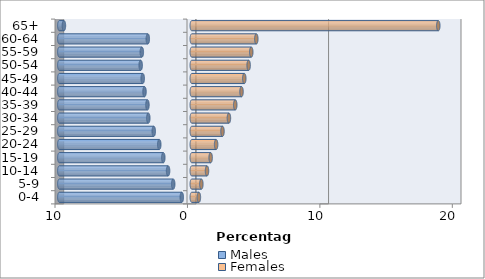
| Category | Males | Females |
|---|---|---|
| 0-4 | -0.754 | 0.536 |
| 5-9 | -1.402 | 0.723 |
| 10-14 | -1.79 | 1.149 |
| 15-19 | -2.15 | 1.424 |
| 20-24 | -2.455 | 1.838 |
| 25-29 | -2.871 | 2.319 |
| 30-34 | -3.283 | 2.805 |
| 35-39 | -3.349 | 3.282 |
| 40-44 | -3.57 | 3.755 |
| 45-49 | -3.705 | 3.964 |
| 50-54 | -3.859 | 4.294 |
| 55-59 | -3.772 | 4.491 |
| 60-64 | -3.32 | 4.873 |
| 65+ | -9.654 | 18.613 |